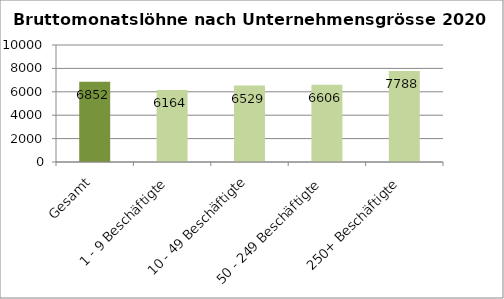
| Category | 2020 |
|---|---|
| Gesamt | 6852 |
| 1 - 9 Beschäftigte | 6164 |
| 10 - 49 Beschäftigte | 6529 |
| 50 - 249 Beschäftigte | 6606 |
| 250+ Beschäftigte | 7788 |